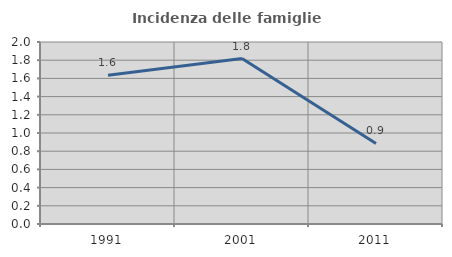
| Category | Incidenza delle famiglie numerose |
|---|---|
| 1991.0 | 1.633 |
| 2001.0 | 1.818 |
| 2011.0 | 0.885 |